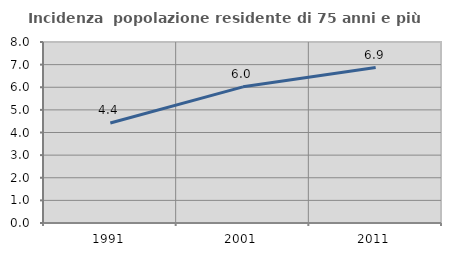
| Category | Incidenza  popolazione residente di 75 anni e più |
|---|---|
| 1991.0 | 4.421 |
| 2001.0 | 6.017 |
| 2011.0 | 6.869 |